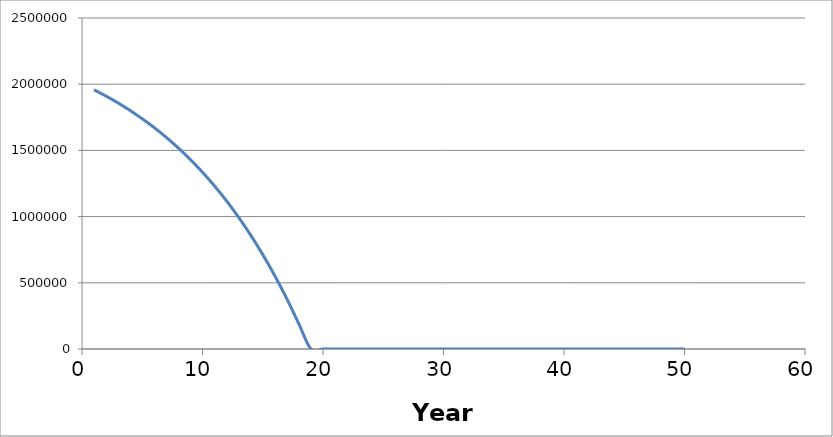
| Category | Year-end balance |
|---|---|
| 1.0 | 1957773.397 |
| 2.0 | 1909942.965 |
| 3.0 | 1857807.166 |
| 4.0 | 1800978.461 |
| 5.0 | 1739034.427 |
| 6.0 | 1671514.618 |
| 7.0 | 1597917.141 |
| 8.0 | 1517694.925 |
| 9.0 | 1430251.658 |
| 10.0 | 1334937.349 |
| 11.0 | 1231043.503 |
| 12.0 | 1117797.847 |
| 13.0 | 994358.598 |
| 14.0 | 859808.196 |
| 15.0 | 713146.494 |
| 16.0 | 553283.315 |
| 17.0 | 379030.353 |
| 18.0 | 189092.339 |
| 19.0 | 0 |
| 20.0 | 0 |
| 21.0 | 0 |
| 22.0 | 0 |
| 23.0 | 0 |
| 24.0 | 0 |
| 25.0 | 0 |
| 26.0 | 0 |
| 27.0 | 0 |
| 28.0 | 0 |
| 29.0 | 0 |
| 30.0 | 0 |
| 31.0 | 0 |
| 32.0 | 0 |
| 33.0 | 0 |
| 34.0 | 0 |
| 35.0 | 0 |
| 36.0 | 0 |
| 37.0 | 0 |
| 38.0 | 0 |
| 39.0 | 0 |
| 40.0 | 0 |
| 41.0 | 0 |
| 42.0 | 0 |
| 43.0 | 0 |
| 44.0 | 0 |
| 45.0 | 0 |
| 46.0 | 0 |
| 47.0 | 0 |
| 48.0 | 0 |
| 49.0 | 0 |
| 50.0 | 0 |